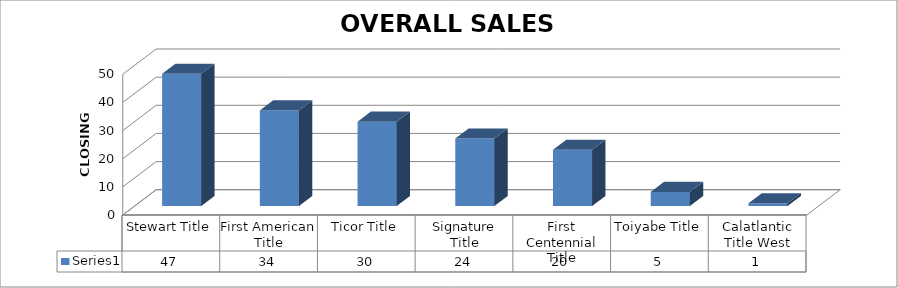
| Category | Series 0 |
|---|---|
| Stewart Title | 47 |
| First American Title | 34 |
| Ticor Title | 30 |
| Signature Title | 24 |
| First Centennial Title | 20 |
| Toiyabe Title | 5 |
| Calatlantic Title West | 1 |